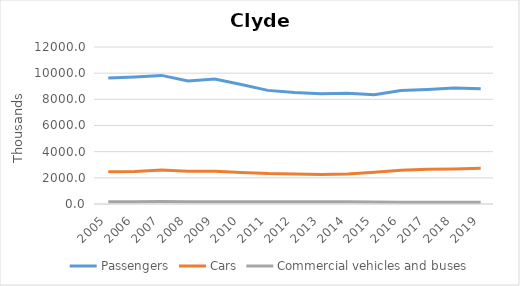
| Category | Passengers | Cars | Commercial vehicles and buses |
|---|---|---|---|
| 2005.0 | 9625.92 | 2467.318 | 172.338 |
| 2006.0 | 9707.302 | 2478.394 | 179.1 |
| 2007.0 | 9829.96 | 2594.02 | 182.778 |
| 2008.0 | 9397.928 | 2498.34 | 175.574 |
| 2009.0 | 9544.848 | 2501.782 | 166.956 |
| 2010.0 | 9134.432 | 2415.2 | 166.628 |
| 2011.0 | 8683.829 | 2331.564 | 172.878 |
| 2012.0 | 8527.304 | 2299.125 | 174.126 |
| 2013.0 | 8435.062 | 2247.168 | 168.48 |
| 2014.0 | 8462.458 | 2294.201 | 167 |
| 2015.0 | 8357.653 | 2430.805 | 150.8 |
| 2016.0 | 8673.8 | 2584.2 | 135.8 |
| 2017.0 | 8759 | 2661.6 | 141.8 |
| 2018.0 | 8865 | 2684.6 | 139 |
| 2019.0 | 8810.648 | 2729.2 | 124.6 |